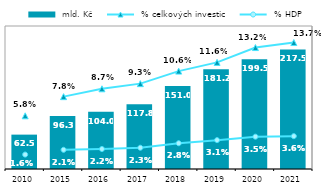
| Category |  mld. Kč |
|---|---|
| 2010.0 | 62.501 |
| 2015.0 | 96.27 |
| 2016.0 | 104.02 |
| 2017.0 | 117.816 |
| 2018.0 | 150.99 |
| 2019.0 | 181.171 |
| 2020.0 | 199.524 |
| 2021.0 | 217.45 |